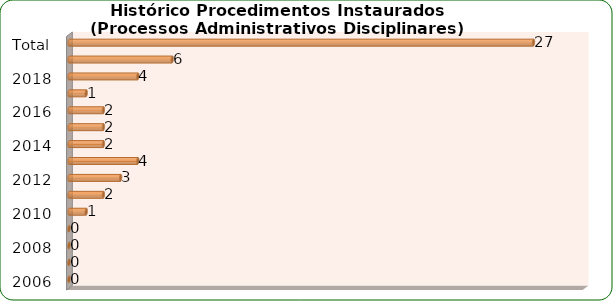
| Category | Total de Processos Administrativos Disciplinares |
|---|---|
| 2006 | 0 |
| 2007 | 0 |
| 2008 | 0 |
| 2009 | 0 |
| 2010 | 1 |
| 2011 | 2 |
| 2012 | 3 |
| 2013 | 4 |
| 2014 | 2 |
| 2015 | 2 |
| 2016 | 2 |
| 2017 | 1 |
| 2018 | 4 |
| 2019 | 6 |
| Total | 27 |